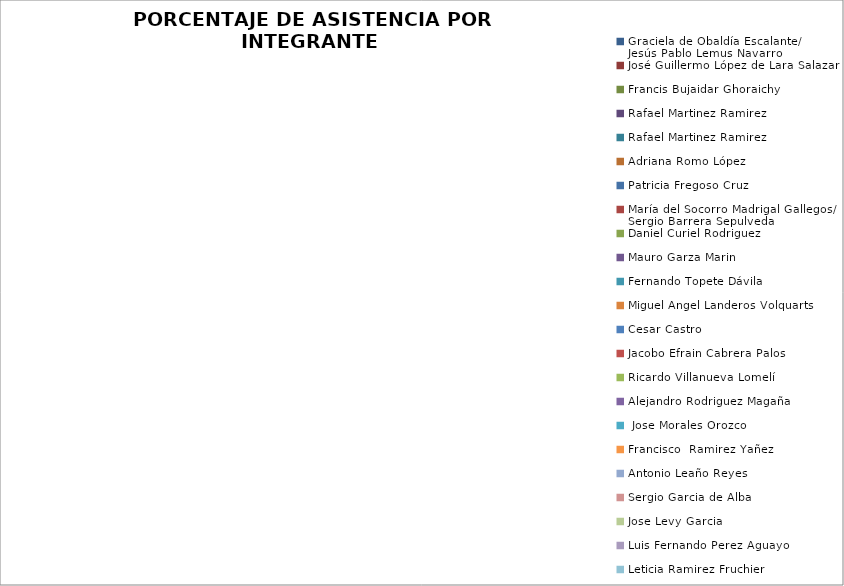
| Category | Series 0 |
|---|---|
| Graciela de Obaldía Escalante/ 
Jesús Pablo Lemus Navarro | 0 |
| José Guillermo López de Lara Salazar | 0 |
| Francis Bujaidar Ghoraichy | 0 |
| Rafael Martinez Ramirez | 0 |
| Rafael Martinez Ramirez | 0 |
| Adriana Romo López | 0 |
| Patricia Fregoso Cruz | 0 |
| María del Socorro Madrigal Gallegos/ 
Sergio Barrera Sepulveda | 0 |
| Daniel Curiel Rodriguez | 0 |
| Mauro Garza Marin | 0 |
| Fernando Topete Dávila | 0 |
| Miguel Angel Landeros Volquarts | 0 |
| Cesar Castro | 0 |
| Jacobo Efrain Cabrera Palos | 0 |
| Ricardo Villanueva Lomelí | 0 |
| Alejandro Rodriguez Magaña | 0 |
|  Jose Morales Orozco | 0 |
| Francisco  Ramirez Yañez | 0 |
| Antonio Leaño Reyes | 0 |
| Sergio Garcia de Alba | 0 |
| Jose Levy Garcia | 0 |
| Luis Fernando Perez Aguayo | 0 |
| Leticia Ramirez Fruchier | 0 |
| Fernando Sanchez Antillon | 0 |